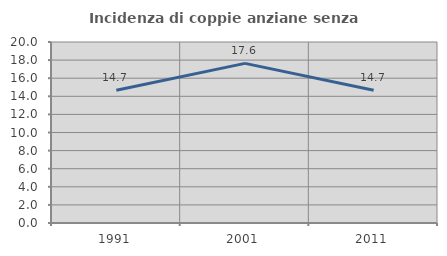
| Category | Incidenza di coppie anziane senza figli  |
|---|---|
| 1991.0 | 14.677 |
| 2001.0 | 17.635 |
| 2011.0 | 14.675 |